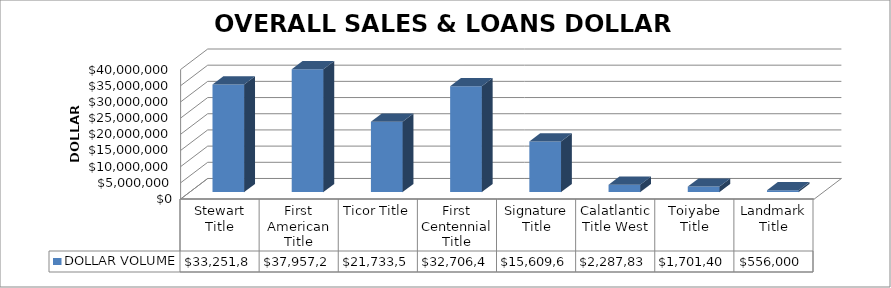
| Category | DOLLAR VOLUME |
|---|---|
| Stewart Title | 33251872 |
| First American Title | 37957200 |
| Ticor Title | 21733558 |
| First Centennial Title | 32706415 |
| Signature Title | 15609673 |
| Calatlantic Title West | 2287839 |
| Toiyabe Title | 1701400 |
| Landmark Title | 556000 |